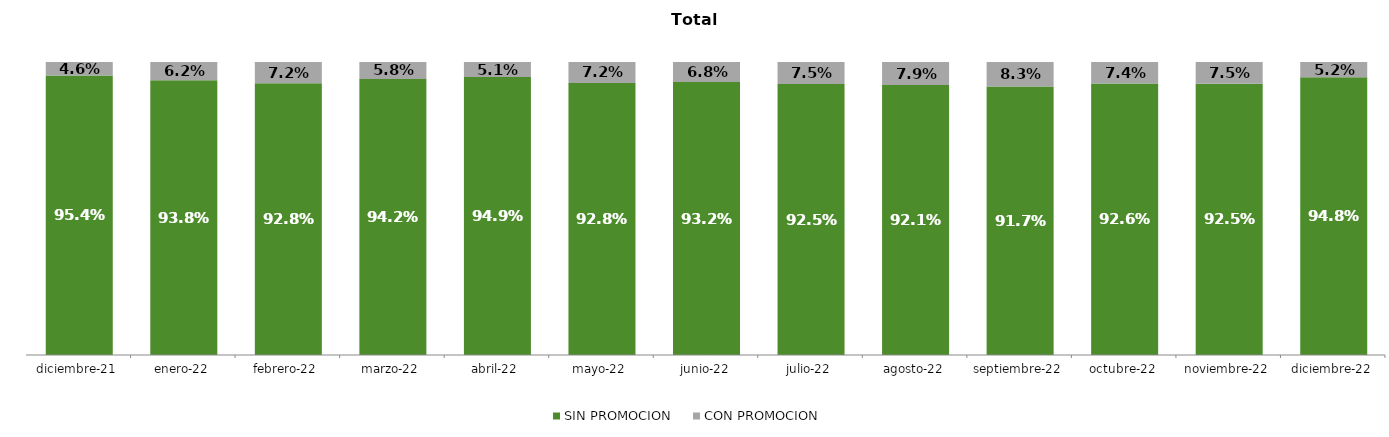
| Category | SIN PROMOCION   | CON PROMOCION   |
|---|---|---|
| 2021-12-01 | 0.954 | 0.046 |
| 2022-01-01 | 0.938 | 0.062 |
| 2022-02-01 | 0.928 | 0.072 |
| 2022-03-01 | 0.942 | 0.058 |
| 2022-04-01 | 0.949 | 0.051 |
| 2022-05-01 | 0.928 | 0.072 |
| 2022-06-01 | 0.932 | 0.068 |
| 2022-07-01 | 0.925 | 0.075 |
| 2022-08-01 | 0.921 | 0.079 |
| 2022-09-01 | 0.917 | 0.083 |
| 2022-10-01 | 0.926 | 0.074 |
| 2022-11-01 | 0.925 | 0.075 |
| 2022-12-01 | 0.948 | 0.052 |